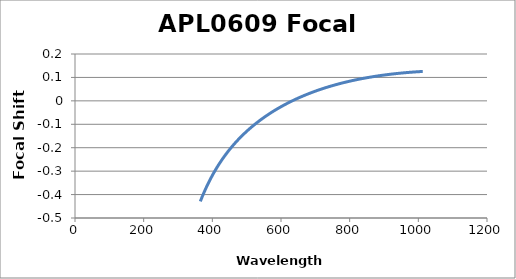
| Category | Focal Shift (mm) |
|---|---|
| 365.0 | -0.429 |
| 366.0 | -0.425 |
| 367.0 | -0.422 |
| 368.0 | -0.418 |
| 369.0 | -0.415 |
| 370.0 | -0.411 |
| 371.0 | -0.407 |
| 372.0 | -0.404 |
| 373.0 | -0.4 |
| 374.0 | -0.397 |
| 375.0 | -0.394 |
| 376.0 | -0.39 |
| 377.0 | -0.387 |
| 378.0 | -0.384 |
| 379.0 | -0.38 |
| 380.0 | -0.377 |
| 381.0 | -0.374 |
| 382.0 | -0.371 |
| 383.0 | -0.368 |
| 384.0 | -0.364 |
| 385.0 | -0.361 |
| 386.0 | -0.358 |
| 387.0 | -0.355 |
| 388.0 | -0.352 |
| 389.0 | -0.349 |
| 390.0 | -0.346 |
| 391.0 | -0.343 |
| 392.0 | -0.341 |
| 393.0 | -0.338 |
| 394.0 | -0.335 |
| 395.0 | -0.332 |
| 396.0 | -0.329 |
| 397.0 | -0.327 |
| 398.0 | -0.324 |
| 399.0 | -0.321 |
| 400.0 | -0.318 |
| 401.0 | -0.316 |
| 402.0 | -0.313 |
| 403.0 | -0.31 |
| 404.0 | -0.308 |
| 405.0 | -0.305 |
| 406.0 | -0.303 |
| 407.0 | -0.3 |
| 408.0 | -0.298 |
| 409.0 | -0.295 |
| 410.0 | -0.293 |
| 411.0 | -0.29 |
| 412.0 | -0.288 |
| 413.0 | -0.285 |
| 414.0 | -0.283 |
| 415.0 | -0.281 |
| 416.0 | -0.278 |
| 417.0 | -0.276 |
| 418.0 | -0.274 |
| 419.0 | -0.271 |
| 420.0 | -0.269 |
| 421.0 | -0.267 |
| 422.0 | -0.265 |
| 423.0 | -0.262 |
| 424.0 | -0.26 |
| 425.0 | -0.258 |
| 426.0 | -0.256 |
| 427.0 | -0.254 |
| 428.0 | -0.251 |
| 429.0 | -0.249 |
| 430.0 | -0.247 |
| 431.0 | -0.245 |
| 432.0 | -0.243 |
| 433.0 | -0.241 |
| 434.0 | -0.239 |
| 435.0 | -0.237 |
| 436.0 | -0.235 |
| 437.0 | -0.233 |
| 438.0 | -0.231 |
| 439.0 | -0.229 |
| 440.0 | -0.227 |
| 441.0 | -0.225 |
| 442.0 | -0.223 |
| 443.0 | -0.221 |
| 444.0 | -0.219 |
| 445.0 | -0.217 |
| 446.0 | -0.216 |
| 447.0 | -0.214 |
| 448.0 | -0.212 |
| 449.0 | -0.21 |
| 450.0 | -0.208 |
| 451.0 | -0.206 |
| 452.0 | -0.205 |
| 453.0 | -0.203 |
| 454.0 | -0.201 |
| 455.0 | -0.199 |
| 456.0 | -0.197 |
| 457.0 | -0.196 |
| 458.0 | -0.194 |
| 459.0 | -0.192 |
| 460.0 | -0.191 |
| 461.0 | -0.189 |
| 462.0 | -0.187 |
| 463.0 | -0.186 |
| 464.0 | -0.184 |
| 465.0 | -0.182 |
| 466.0 | -0.181 |
| 467.0 | -0.179 |
| 468.0 | -0.177 |
| 469.0 | -0.176 |
| 470.0 | -0.174 |
| 471.0 | -0.172 |
| 472.0 | -0.171 |
| 473.0 | -0.169 |
| 474.0 | -0.168 |
| 475.0 | -0.166 |
| 476.0 | -0.165 |
| 477.0 | -0.163 |
| 478.0 | -0.162 |
| 479.0 | -0.16 |
| 480.0 | -0.159 |
| 481.0 | -0.157 |
| 482.0 | -0.156 |
| 483.0 | -0.154 |
| 484.0 | -0.153 |
| 485.0 | -0.151 |
| 486.0 | -0.15 |
| 487.0 | -0.148 |
| 488.0 | -0.147 |
| 489.0 | -0.145 |
| 490.0 | -0.144 |
| 491.0 | -0.143 |
| 492.0 | -0.141 |
| 493.0 | -0.14 |
| 494.0 | -0.138 |
| 495.0 | -0.137 |
| 496.0 | -0.136 |
| 497.0 | -0.134 |
| 498.0 | -0.133 |
| 499.0 | -0.132 |
| 500.0 | -0.13 |
| 501.0 | -0.129 |
| 502.0 | -0.128 |
| 503.0 | -0.126 |
| 504.0 | -0.125 |
| 505.0 | -0.124 |
| 506.0 | -0.122 |
| 507.0 | -0.121 |
| 508.0 | -0.12 |
| 509.0 | -0.118 |
| 510.0 | -0.117 |
| 511.0 | -0.116 |
| 512.0 | -0.115 |
| 513.0 | -0.113 |
| 514.0 | -0.112 |
| 515.0 | -0.111 |
| 516.0 | -0.11 |
| 517.0 | -0.108 |
| 518.0 | -0.107 |
| 519.0 | -0.106 |
| 520.0 | -0.105 |
| 521.0 | -0.104 |
| 522.0 | -0.102 |
| 523.0 | -0.101 |
| 524.0 | -0.1 |
| 525.0 | -0.099 |
| 526.0 | -0.098 |
| 527.0 | -0.096 |
| 528.0 | -0.095 |
| 529.0 | -0.094 |
| 530.0 | -0.093 |
| 531.0 | -0.092 |
| 532.0 | -0.091 |
| 533.0 | -0.09 |
| 534.0 | -0.089 |
| 535.0 | -0.087 |
| 536.0 | -0.086 |
| 537.0 | -0.085 |
| 538.0 | -0.084 |
| 539.0 | -0.083 |
| 540.0 | -0.082 |
| 541.0 | -0.081 |
| 542.0 | -0.08 |
| 543.0 | -0.079 |
| 544.0 | -0.078 |
| 545.0 | -0.076 |
| 546.0 | -0.075 |
| 547.0 | -0.074 |
| 548.0 | -0.073 |
| 549.0 | -0.072 |
| 550.0 | -0.071 |
| 551.0 | -0.07 |
| 552.0 | -0.069 |
| 553.0 | -0.068 |
| 554.0 | -0.067 |
| 555.0 | -0.066 |
| 556.0 | -0.065 |
| 557.0 | -0.064 |
| 558.0 | -0.063 |
| 559.0 | -0.062 |
| 560.0 | -0.061 |
| 561.0 | -0.06 |
| 562.0 | -0.059 |
| 563.0 | -0.058 |
| 564.0 | -0.057 |
| 565.0 | -0.056 |
| 566.0 | -0.055 |
| 567.0 | -0.054 |
| 568.0 | -0.053 |
| 569.0 | -0.052 |
| 570.0 | -0.051 |
| 571.0 | -0.051 |
| 572.0 | -0.05 |
| 573.0 | -0.049 |
| 574.0 | -0.048 |
| 575.0 | -0.047 |
| 576.0 | -0.046 |
| 577.0 | -0.045 |
| 578.0 | -0.044 |
| 579.0 | -0.043 |
| 580.0 | -0.042 |
| 581.0 | -0.041 |
| 582.0 | -0.04 |
| 583.0 | -0.04 |
| 584.0 | -0.039 |
| 585.0 | -0.038 |
| 586.0 | -0.037 |
| 587.0 | -0.036 |
| 588.0 | -0.035 |
| 589.0 | -0.034 |
| 590.0 | -0.033 |
| 591.0 | -0.033 |
| 592.0 | -0.032 |
| 593.0 | -0.031 |
| 594.0 | -0.03 |
| 595.0 | -0.029 |
| 596.0 | -0.028 |
| 597.0 | -0.028 |
| 598.0 | -0.027 |
| 599.0 | -0.026 |
| 600.0 | -0.025 |
| 601.0 | -0.024 |
| 602.0 | -0.023 |
| 603.0 | -0.023 |
| 604.0 | -0.022 |
| 605.0 | -0.021 |
| 606.0 | -0.02 |
| 607.0 | -0.019 |
| 608.0 | -0.019 |
| 609.0 | -0.018 |
| 610.0 | -0.017 |
| 611.0 | -0.016 |
| 612.0 | -0.015 |
| 613.0 | -0.015 |
| 614.0 | -0.014 |
| 615.0 | -0.013 |
| 616.0 | -0.012 |
| 617.0 | -0.012 |
| 618.0 | -0.011 |
| 619.0 | -0.01 |
| 620.0 | -0.009 |
| 621.0 | -0.009 |
| 622.0 | -0.008 |
| 623.0 | -0.007 |
| 624.0 | -0.006 |
| 625.0 | -0.006 |
| 626.0 | -0.005 |
| 627.0 | -0.004 |
| 628.0 | -0.003 |
| 629.0 | -0.003 |
| 630.0 | -0.002 |
| 631.0 | -0.001 |
| 632.0 | -0.001 |
| 633.0 | 0 |
| 634.0 | 0.001 |
| 635.0 | 0.002 |
| 636.0 | 0.002 |
| 637.0 | 0.003 |
| 638.0 | 0.004 |
| 639.0 | 0.004 |
| 640.0 | 0.005 |
| 641.0 | 0.006 |
| 642.0 | 0.006 |
| 643.0 | 0.007 |
| 644.0 | 0.008 |
| 645.0 | 0.008 |
| 646.0 | 0.009 |
| 647.0 | 0.01 |
| 648.0 | 0.01 |
| 649.0 | 0.011 |
| 650.0 | 0.012 |
| 651.0 | 0.012 |
| 652.0 | 0.013 |
| 653.0 | 0.014 |
| 654.0 | 0.014 |
| 655.0 | 0.015 |
| 656.0 | 0.016 |
| 657.0 | 0.016 |
| 658.0 | 0.017 |
| 659.0 | 0.018 |
| 660.0 | 0.018 |
| 661.0 | 0.019 |
| 662.0 | 0.019 |
| 663.0 | 0.02 |
| 664.0 | 0.021 |
| 665.0 | 0.021 |
| 666.0 | 0.022 |
| 667.0 | 0.023 |
| 668.0 | 0.023 |
| 669.0 | 0.024 |
| 670.0 | 0.024 |
| 671.0 | 0.025 |
| 672.0 | 0.026 |
| 673.0 | 0.026 |
| 674.0 | 0.027 |
| 675.0 | 0.027 |
| 676.0 | 0.028 |
| 677.0 | 0.029 |
| 678.0 | 0.029 |
| 679.0 | 0.03 |
| 680.0 | 0.03 |
| 681.0 | 0.031 |
| 682.0 | 0.031 |
| 683.0 | 0.032 |
| 684.0 | 0.033 |
| 685.0 | 0.033 |
| 686.0 | 0.034 |
| 687.0 | 0.034 |
| 688.0 | 0.035 |
| 689.0 | 0.035 |
| 690.0 | 0.036 |
| 691.0 | 0.036 |
| 692.0 | 0.037 |
| 693.0 | 0.038 |
| 694.0 | 0.038 |
| 695.0 | 0.039 |
| 696.0 | 0.039 |
| 697.0 | 0.04 |
| 698.0 | 0.04 |
| 699.0 | 0.041 |
| 700.0 | 0.041 |
| 701.0 | 0.042 |
| 702.0 | 0.042 |
| 703.0 | 0.043 |
| 704.0 | 0.043 |
| 705.0 | 0.044 |
| 706.0 | 0.044 |
| 707.0 | 0.045 |
| 708.0 | 0.045 |
| 709.0 | 0.046 |
| 710.0 | 0.047 |
| 711.0 | 0.047 |
| 712.0 | 0.048 |
| 713.0 | 0.048 |
| 714.0 | 0.049 |
| 715.0 | 0.049 |
| 716.0 | 0.049 |
| 717.0 | 0.05 |
| 718.0 | 0.05 |
| 719.0 | 0.051 |
| 720.0 | 0.051 |
| 721.0 | 0.052 |
| 722.0 | 0.052 |
| 723.0 | 0.053 |
| 724.0 | 0.053 |
| 725.0 | 0.054 |
| 726.0 | 0.054 |
| 727.0 | 0.055 |
| 728.0 | 0.055 |
| 729.0 | 0.056 |
| 730.0 | 0.056 |
| 731.0 | 0.057 |
| 732.0 | 0.057 |
| 733.0 | 0.058 |
| 734.0 | 0.058 |
| 735.0 | 0.058 |
| 736.0 | 0.059 |
| 737.0 | 0.059 |
| 738.0 | 0.06 |
| 739.0 | 0.06 |
| 740.0 | 0.061 |
| 741.0 | 0.061 |
| 742.0 | 0.062 |
| 743.0 | 0.062 |
| 744.0 | 0.062 |
| 745.0 | 0.063 |
| 746.0 | 0.063 |
| 747.0 | 0.064 |
| 748.0 | 0.064 |
| 749.0 | 0.065 |
| 750.0 | 0.065 |
| 751.0 | 0.065 |
| 752.0 | 0.066 |
| 753.0 | 0.066 |
| 754.0 | 0.067 |
| 755.0 | 0.067 |
| 756.0 | 0.068 |
| 757.0 | 0.068 |
| 758.0 | 0.068 |
| 759.0 | 0.069 |
| 760.0 | 0.069 |
| 761.0 | 0.07 |
| 762.0 | 0.07 |
| 763.0 | 0.07 |
| 764.0 | 0.071 |
| 765.0 | 0.071 |
| 766.0 | 0.072 |
| 767.0 | 0.072 |
| 768.0 | 0.072 |
| 769.0 | 0.073 |
| 770.0 | 0.073 |
| 771.0 | 0.074 |
| 772.0 | 0.074 |
| 773.0 | 0.074 |
| 774.0 | 0.075 |
| 775.0 | 0.075 |
| 776.0 | 0.075 |
| 777.0 | 0.076 |
| 778.0 | 0.076 |
| 779.0 | 0.077 |
| 780.0 | 0.077 |
| 781.0 | 0.077 |
| 782.0 | 0.078 |
| 783.0 | 0.078 |
| 784.0 | 0.078 |
| 785.0 | 0.079 |
| 786.0 | 0.079 |
| 787.0 | 0.079 |
| 788.0 | 0.08 |
| 789.0 | 0.08 |
| 790.0 | 0.08 |
| 791.0 | 0.081 |
| 792.0 | 0.081 |
| 793.0 | 0.082 |
| 794.0 | 0.082 |
| 795.0 | 0.082 |
| 796.0 | 0.083 |
| 797.0 | 0.083 |
| 798.0 | 0.083 |
| 799.0 | 0.084 |
| 800.0 | 0.084 |
| 801.0 | 0.084 |
| 802.0 | 0.085 |
| 803.0 | 0.085 |
| 804.0 | 0.085 |
| 805.0 | 0.086 |
| 806.0 | 0.086 |
| 807.0 | 0.086 |
| 808.0 | 0.087 |
| 809.0 | 0.087 |
| 810.0 | 0.087 |
| 811.0 | 0.087 |
| 812.0 | 0.088 |
| 813.0 | 0.088 |
| 814.0 | 0.088 |
| 815.0 | 0.089 |
| 816.0 | 0.089 |
| 817.0 | 0.089 |
| 818.0 | 0.09 |
| 819.0 | 0.09 |
| 820.0 | 0.09 |
| 821.0 | 0.091 |
| 822.0 | 0.091 |
| 823.0 | 0.091 |
| 824.0 | 0.091 |
| 825.0 | 0.092 |
| 826.0 | 0.092 |
| 827.0 | 0.092 |
| 828.0 | 0.093 |
| 829.0 | 0.093 |
| 830.0 | 0.093 |
| 831.0 | 0.094 |
| 832.0 | 0.094 |
| 833.0 | 0.094 |
| 834.0 | 0.094 |
| 835.0 | 0.095 |
| 836.0 | 0.095 |
| 837.0 | 0.095 |
| 838.0 | 0.096 |
| 839.0 | 0.096 |
| 840.0 | 0.096 |
| 841.0 | 0.096 |
| 842.0 | 0.097 |
| 843.0 | 0.097 |
| 844.0 | 0.097 |
| 845.0 | 0.097 |
| 846.0 | 0.098 |
| 847.0 | 0.098 |
| 848.0 | 0.098 |
| 849.0 | 0.098 |
| 850.0 | 0.099 |
| 851.0 | 0.099 |
| 852.0 | 0.099 |
| 853.0 | 0.1 |
| 854.0 | 0.1 |
| 855.0 | 0.1 |
| 856.0 | 0.1 |
| 857.0 | 0.101 |
| 858.0 | 0.101 |
| 859.0 | 0.101 |
| 860.0 | 0.101 |
| 861.0 | 0.102 |
| 862.0 | 0.102 |
| 863.0 | 0.102 |
| 864.0 | 0.102 |
| 865.0 | 0.102 |
| 866.0 | 0.103 |
| 867.0 | 0.103 |
| 868.0 | 0.103 |
| 869.0 | 0.103 |
| 870.0 | 0.104 |
| 871.0 | 0.104 |
| 872.0 | 0.104 |
| 873.0 | 0.104 |
| 874.0 | 0.105 |
| 875.0 | 0.105 |
| 876.0 | 0.105 |
| 877.0 | 0.105 |
| 878.0 | 0.105 |
| 879.0 | 0.106 |
| 880.0 | 0.106 |
| 881.0 | 0.106 |
| 882.0 | 0.106 |
| 883.0 | 0.107 |
| 884.0 | 0.107 |
| 885.0 | 0.107 |
| 886.0 | 0.107 |
| 887.0 | 0.107 |
| 888.0 | 0.108 |
| 889.0 | 0.108 |
| 890.0 | 0.108 |
| 891.0 | 0.108 |
| 892.0 | 0.108 |
| 893.0 | 0.109 |
| 894.0 | 0.109 |
| 895.0 | 0.109 |
| 896.0 | 0.109 |
| 897.0 | 0.11 |
| 898.0 | 0.11 |
| 899.0 | 0.11 |
| 900.0 | 0.11 |
| 901.0 | 0.11 |
| 902.0 | 0.11 |
| 903.0 | 0.111 |
| 904.0 | 0.111 |
| 905.0 | 0.111 |
| 906.0 | 0.111 |
| 907.0 | 0.111 |
| 908.0 | 0.112 |
| 909.0 | 0.112 |
| 910.0 | 0.112 |
| 911.0 | 0.112 |
| 912.0 | 0.112 |
| 913.0 | 0.113 |
| 914.0 | 0.113 |
| 915.0 | 0.113 |
| 916.0 | 0.113 |
| 917.0 | 0.113 |
| 918.0 | 0.113 |
| 919.0 | 0.114 |
| 920.0 | 0.114 |
| 921.0 | 0.114 |
| 922.0 | 0.114 |
| 923.0 | 0.114 |
| 924.0 | 0.114 |
| 925.0 | 0.115 |
| 926.0 | 0.115 |
| 927.0 | 0.115 |
| 928.0 | 0.115 |
| 929.0 | 0.115 |
| 930.0 | 0.115 |
| 931.0 | 0.116 |
| 932.0 | 0.116 |
| 933.0 | 0.116 |
| 934.0 | 0.116 |
| 935.0 | 0.116 |
| 936.0 | 0.116 |
| 937.0 | 0.117 |
| 938.0 | 0.117 |
| 939.0 | 0.117 |
| 940.0 | 0.117 |
| 941.0 | 0.117 |
| 942.0 | 0.117 |
| 943.0 | 0.118 |
| 944.0 | 0.118 |
| 945.0 | 0.118 |
| 946.0 | 0.118 |
| 947.0 | 0.118 |
| 948.0 | 0.118 |
| 949.0 | 0.118 |
| 950.0 | 0.119 |
| 951.0 | 0.119 |
| 952.0 | 0.119 |
| 953.0 | 0.119 |
| 954.0 | 0.119 |
| 955.0 | 0.119 |
| 956.0 | 0.119 |
| 957.0 | 0.12 |
| 958.0 | 0.12 |
| 959.0 | 0.12 |
| 960.0 | 0.12 |
| 961.0 | 0.12 |
| 962.0 | 0.12 |
| 963.0 | 0.12 |
| 964.0 | 0.12 |
| 965.0 | 0.121 |
| 966.0 | 0.121 |
| 967.0 | 0.121 |
| 968.0 | 0.121 |
| 969.0 | 0.121 |
| 970.0 | 0.121 |
| 971.0 | 0.121 |
| 972.0 | 0.121 |
| 973.0 | 0.122 |
| 974.0 | 0.122 |
| 975.0 | 0.122 |
| 976.0 | 0.122 |
| 977.0 | 0.122 |
| 978.0 | 0.122 |
| 979.0 | 0.122 |
| 980.0 | 0.122 |
| 981.0 | 0.122 |
| 982.0 | 0.123 |
| 983.0 | 0.123 |
| 984.0 | 0.123 |
| 985.0 | 0.123 |
| 986.0 | 0.123 |
| 987.0 | 0.123 |
| 988.0 | 0.123 |
| 989.0 | 0.123 |
| 990.0 | 0.123 |
| 991.0 | 0.124 |
| 992.0 | 0.124 |
| 993.0 | 0.124 |
| 994.0 | 0.124 |
| 995.0 | 0.124 |
| 996.0 | 0.124 |
| 997.0 | 0.124 |
| 998.0 | 0.124 |
| 999.0 | 0.124 |
| 1000.0 | 0.124 |
| 1001.0 | 0.125 |
| 1002.0 | 0.125 |
| 1003.0 | 0.125 |
| 1004.0 | 0.125 |
| 1005.0 | 0.125 |
| 1006.0 | 0.125 |
| 1007.0 | 0.125 |
| 1008.0 | 0.125 |
| 1009.0 | 0.125 |
| 1010.0 | 0.125 |
| 1011.0 | 0.125 |
| 1012.0 | 0.125 |
| 1013.0 | 0.126 |